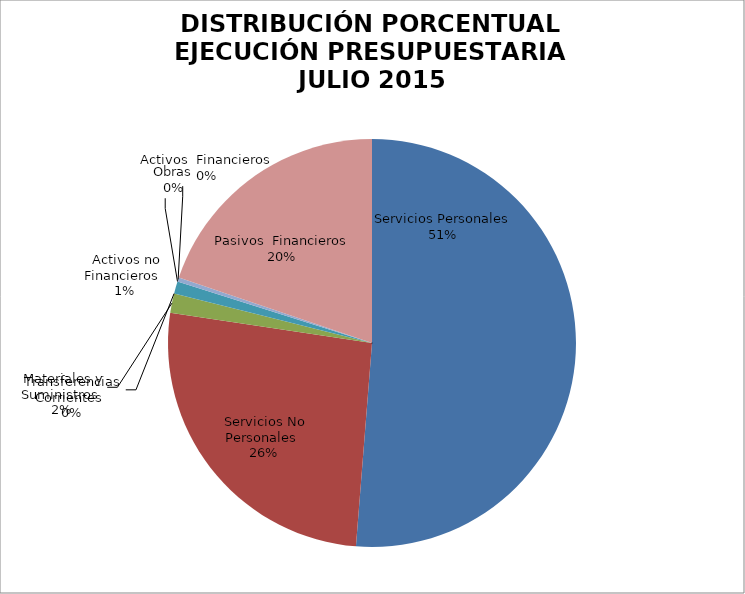
| Category | Series 0 | Series 1 |
|---|---|---|
| Servicios Personales | 10990913.02 | 0.849 |
| Servicios No Personales | 5597994.4 | 0.432 |
| Materiales y Suministros | 329809.96 | 0.025 |
| Transferencias Corrientes | 0 | 0 |
| Activos no Financieros | 209105.08 | 0.016 |
| Obras | 0 | 0 |
| Activos  Financieros | 70545.68 | 0.005 |
| Pasivos  Financieros | -4245375.92 | -0.328 |